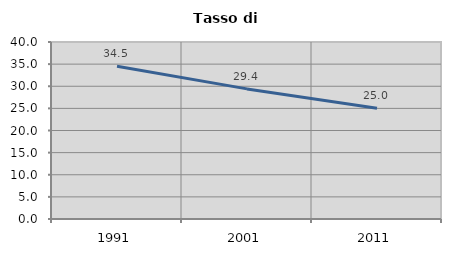
| Category | Tasso di disoccupazione   |
|---|---|
| 1991.0 | 34.513 |
| 2001.0 | 29.402 |
| 2011.0 | 25.021 |